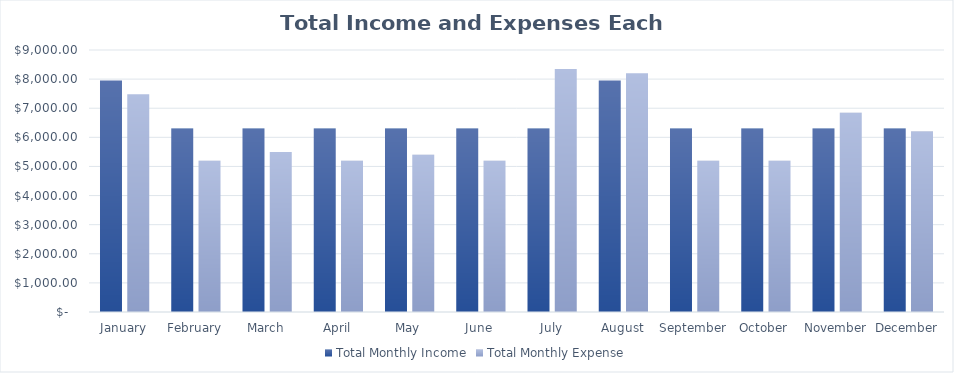
| Category | Total Monthly Income | Total Monthly Expense |
|---|---|---|
| January | 7953.458 | 7477.59 |
| February | 6302.305 | 5197.59 |
| March | 6302.305 | 5497.59 |
| April | 6302.305 | 5197.59 |
| May | 6302.305 | 5397.59 |
| June | 6302.305 | 5197.59 |
| July | 6302.305 | 8347.59 |
| August | 7953.458 | 8197.59 |
| September | 6302.305 | 5197.59 |
| October | 6302.305 | 5197.59 |
| November | 6302.305 | 6847.59 |
| December | 6302.305 | 6197.59 |